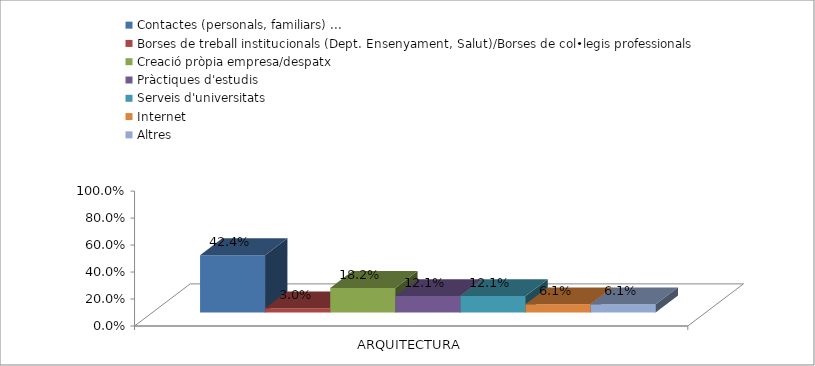
| Category | Contactes (personals, familiars) ... | Borses de treball institucionals (Dept. Ensenyament, Salut)/Borses de col•legis professionals | Creació pròpia empresa/despatx | Pràctiques d'estudis | Serveis d'universitats | Internet | Altres |
|---|---|---|---|---|---|---|---|
| ARQUITECTURA | 0.424 | 0.03 | 0.182 | 0.121 | 0.121 | 0.061 | 0.061 |